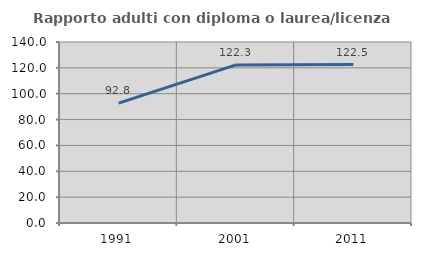
| Category | Rapporto adulti con diploma o laurea/licenza media  |
|---|---|
| 1991.0 | 92.769 |
| 2001.0 | 122.259 |
| 2011.0 | 122.546 |